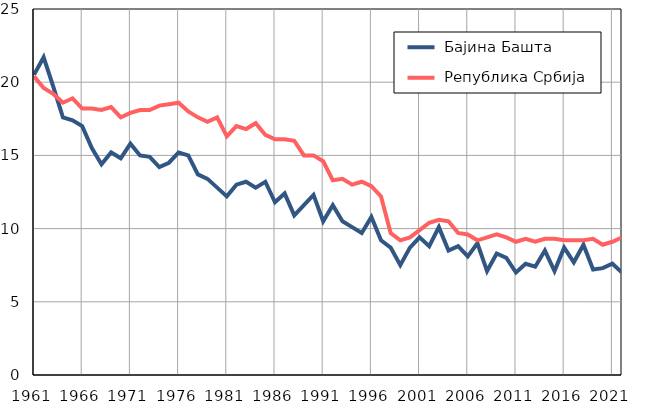
| Category |  Бајина Башта |  Република Србија |
|---|---|---|
| 1961.0 | 20.5 | 20.4 |
| 1962.0 | 21.7 | 19.6 |
| 1963.0 | 19.7 | 19.2 |
| 1964.0 | 17.6 | 18.6 |
| 1965.0 | 17.4 | 18.9 |
| 1966.0 | 17 | 18.2 |
| 1967.0 | 15.5 | 18.2 |
| 1968.0 | 14.4 | 18.1 |
| 1969.0 | 15.2 | 18.3 |
| 1970.0 | 14.8 | 17.6 |
| 1971.0 | 15.8 | 17.9 |
| 1972.0 | 15 | 18.1 |
| 1973.0 | 14.9 | 18.1 |
| 1974.0 | 14.2 | 18.4 |
| 1975.0 | 14.5 | 18.5 |
| 1976.0 | 15.2 | 18.6 |
| 1977.0 | 15 | 18 |
| 1978.0 | 13.7 | 17.6 |
| 1979.0 | 13.4 | 17.3 |
| 1980.0 | 12.8 | 17.6 |
| 1981.0 | 12.2 | 16.3 |
| 1982.0 | 13 | 17 |
| 1983.0 | 13.2 | 16.8 |
| 1984.0 | 12.8 | 17.2 |
| 1985.0 | 13.2 | 16.4 |
| 1986.0 | 11.8 | 16.1 |
| 1987.0 | 12.4 | 16.1 |
| 1988.0 | 10.9 | 16 |
| 1989.0 | 11.6 | 15 |
| 1990.0 | 12.3 | 15 |
| 1991.0 | 10.5 | 14.6 |
| 1992.0 | 11.6 | 13.3 |
| 1993.0 | 10.5 | 13.4 |
| 1994.0 | 10.1 | 13 |
| 1995.0 | 9.7 | 13.2 |
| 1996.0 | 10.8 | 12.9 |
| 1997.0 | 9.2 | 12.2 |
| 1998.0 | 8.7 | 9.7 |
| 1999.0 | 7.5 | 9.2 |
| 2000.0 | 8.7 | 9.4 |
| 2001.0 | 9.4 | 9.9 |
| 2002.0 | 8.8 | 10.4 |
| 2003.0 | 10.1 | 10.6 |
| 2004.0 | 8.5 | 10.5 |
| 2005.0 | 8.8 | 9.7 |
| 2006.0 | 8.1 | 9.6 |
| 2007.0 | 9 | 9.2 |
| 2008.0 | 7.1 | 9.4 |
| 2009.0 | 8.3 | 9.6 |
| 2010.0 | 8 | 9.4 |
| 2011.0 | 7 | 9.1 |
| 2012.0 | 7.6 | 9.3 |
| 2013.0 | 7.4 | 9.1 |
| 2014.0 | 8.5 | 9.3 |
| 2015.0 | 7.1 | 9.3 |
| 2016.0 | 8.7 | 9.2 |
| 2017.0 | 7.7 | 9.2 |
| 2018.0 | 8.9 | 9.2 |
| 2019.0 | 7.2 | 9.3 |
| 2020.0 | 7.3 | 8.9 |
| 2021.0 | 7.6 | 9.1 |
| 2022.0 | 7 | 9.4 |